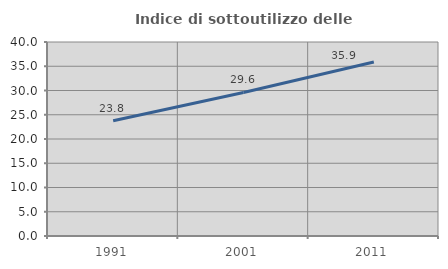
| Category | Indice di sottoutilizzo delle abitazioni  |
|---|---|
| 1991.0 | 23.78 |
| 2001.0 | 29.592 |
| 2011.0 | 35.867 |